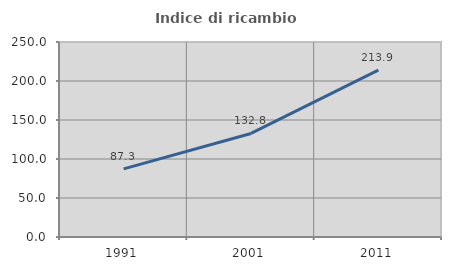
| Category | Indice di ricambio occupazionale  |
|---|---|
| 1991.0 | 87.285 |
| 2001.0 | 132.759 |
| 2011.0 | 213.942 |